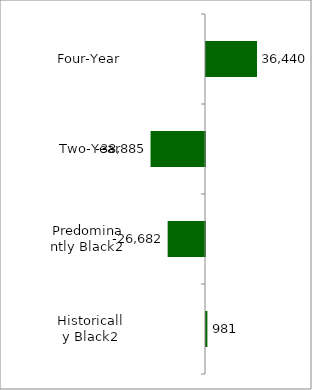
| Category | State |
|---|---|
| Four-Year | 36440 |
| Two-Year | -38885 |
| Predominantly Black2 | -26682 |
| Historically Black2 | 981 |